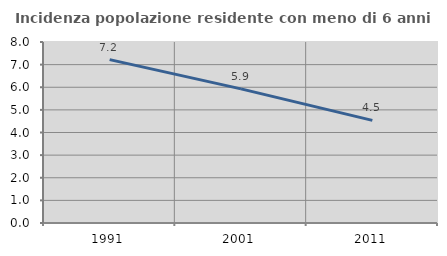
| Category | Incidenza popolazione residente con meno di 6 anni |
|---|---|
| 1991.0 | 7.222 |
| 2001.0 | 5.929 |
| 2011.0 | 4.536 |